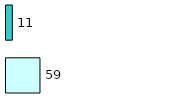
| Category | Series 0 | Series 1 |
|---|---|---|
| 0 | 59 | 11 |